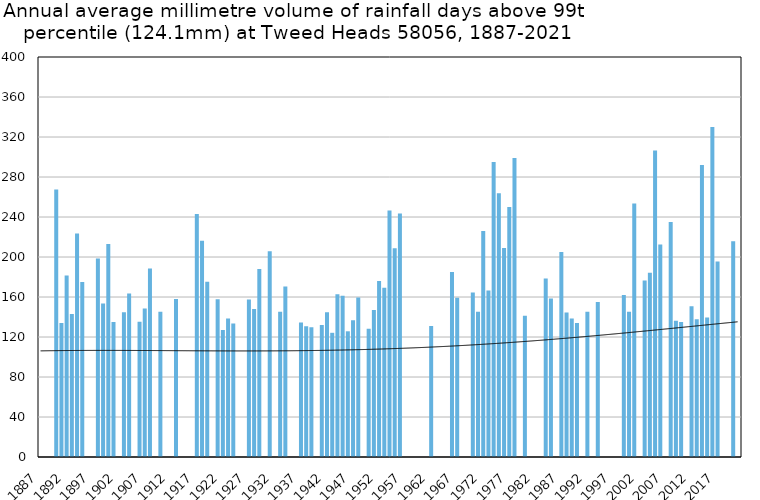
| Category | Annual average mm in days above 99th percentile |
|---|---|
| 1887 | 0 |
| 1888 | 0 |
| 1889 | 0 |
| 1890 | 267.5 |
| 1891 | 133.9 |
| 1892 | 181.6 |
| 1893 | 143 |
| 1894 | 223.55 |
| 1895 | 175 |
| 1896 | 0 |
| 1897 | 0 |
| 1898 | 198.4 |
| 1899 | 153.4 |
| 1900 | 213.1 |
| 1901 | 135.1 |
| 1902 | 0 |
| 1903 | 144.8 |
| 1904 | 163.433 |
| 1905 | 0 |
| 1906 | 135.3 |
| 1907 | 148.6 |
| 1908 | 188.45 |
| 1909 | 0 |
| 1910 | 145.333 |
| 1911 | 0 |
| 1912 | 0 |
| 1913 | 158 |
| 1914 | 0 |
| 1915 | 0 |
| 1916 | 0 |
| 1917 | 243.1 |
| 1918 | 216.2 |
| 1919 | 175.3 |
| 1920 | 0 |
| 1921 | 157.725 |
| 1922 | 127 |
| 1923 | 138.4 |
| 1924 | 133.4 |
| 1925 | 0 |
| 1926 | 0 |
| 1927 | 157.5 |
| 1928 | 148.1 |
| 1929 | 188 |
| 1930 | 0 |
| 1931 | 205.875 |
| 1932 | 0 |
| 1933 | 145.3 |
| 1934 | 170.45 |
| 1935 | 0 |
| 1936 | 0 |
| 1937 | 134.6 |
| 1938 | 130.8 |
| 1939 | 129.8 |
| 1940 | 0 |
| 1941 | 132.1 |
| 1942 | 144.75 |
| 1943 | 124.2 |
| 1944 | 162.8 |
| 1945 | 161.133 |
| 1946 | 125.7 |
| 1947 | 136.7 |
| 1948 | 159.5 |
| 1949 | 0 |
| 1950 | 128.3 |
| 1951 | 146.9 |
| 1952 | 176 |
| 1953 | 169.267 |
| 1954 | 246.467 |
| 1955 | 208.65 |
| 1956 | 243.45 |
| 1957 | 0 |
| 1958 | 0 |
| 1959 | 0 |
| 1960 | 0 |
| 1961 | 0 |
| 1962 | 131.1 |
| 1963 | 0 |
| 1964 | 0 |
| 1965 | 0 |
| 1966 | 184.9 |
| 1967 | 159.2 |
| 1968 | 0 |
| 1969 | 0 |
| 1970 | 164.5 |
| 1971 | 145.3 |
| 1972 | 225.967 |
| 1973 | 166.5 |
| 1974 | 295.06 |
| 1975 | 263.8 |
| 1976 | 209 |
| 1977 | 250 |
| 1978 | 298.9 |
| 1979 | 0 |
| 1980 | 141.3 |
| 1981 | 0 |
| 1982 | 0 |
| 1983 | 0 |
| 1984 | 178.4 |
| 1985 | 158.4 |
| 1986 | 0 |
| 1987 | 205 |
| 1988 | 144.6 |
| 1989 | 138.6 |
| 1990 | 134.067 |
| 1991 | 0 |
| 1992 | 145.2 |
| 1993 | 0 |
| 1994 | 155 |
| 1995 | 0 |
| 1996 | 0 |
| 1997 | 0 |
| 1998 | 0 |
| 1999 | 162.05 |
| 2000 | 145.2 |
| 2001 | 253.6 |
| 2002 | 0 |
| 2003 | 176.6 |
| 2004 | 184.2 |
| 2005 | 306.4 |
| 2006 | 212.4 |
| 2007 | 0 |
| 2008 | 235 |
| 2009 | 136.3 |
| 2010 | 134.9 |
| 2011 | 0 |
| 2012 | 150.733 |
| 2013 | 137.7 |
| 2014 | 292 |
| 2015 | 139.4 |
| 2016 | 330 |
| 2017 | 195.6 |
| 2018 | 0 |
| 2019 | 0 |
| 2020 | 215.64 |
| 2021 | 0 |